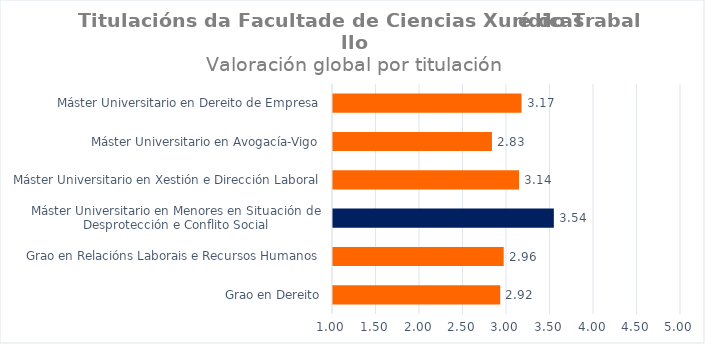
| Category | Series 0 |
|---|---|
| Grao en Dereito | 2.922 |
| Grao en Relacións Laborais e Recursos Humanos | 2.962 |
| Máster Universitario en Menores en Situación de Desprotección e Conflito Social | 3.538 |
| Máster Universitario en Xestión e Dirección Laboral | 3.138 |
| Máster Universitario en Avogacía-Vigo | 2.827 |
| Máster Universitario en Dereito de Empresa | 3.167 |